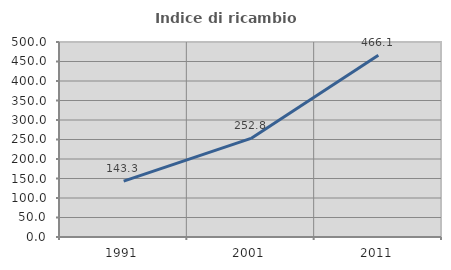
| Category | Indice di ricambio occupazionale  |
|---|---|
| 1991.0 | 143.269 |
| 2001.0 | 252.778 |
| 2011.0 | 466.102 |